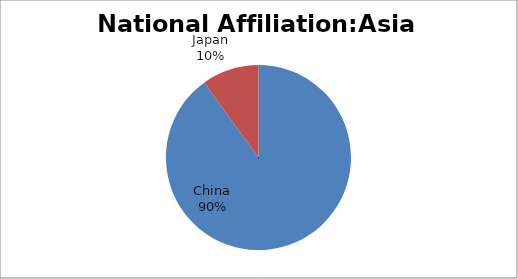
| Category | Series 0 |
|---|---|
| China | 9 |
| Japan | 1 |